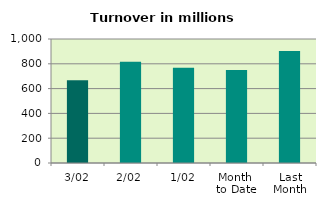
| Category | Series 0 |
|---|---|
| 3/02 | 666.777 |
| 2/02 | 817.493 |
| 1/02 | 768.019 |
| Month 
to Date | 750.763 |
| Last
Month | 902.557 |